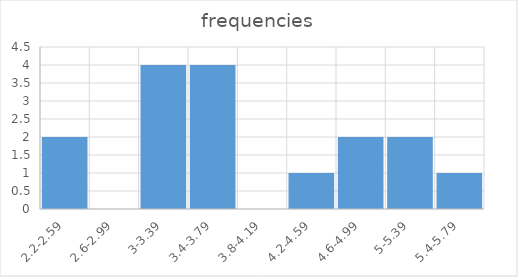
| Category | frequencies |
|---|---|
| 2.2-2.59 | 2 |
| 2.6-2.99 | 0 |
| 3-3.39 | 4 |
| 3.4-3.79 | 4 |
| 3.8-4.19 | 0 |
| 4.2-4.59 | 1 |
| 4.6-4.99 | 2 |
| 5-5.39 | 2 |
| 5.4-5.79 | 1 |